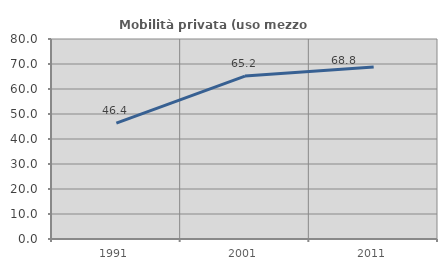
| Category | Mobilità privata (uso mezzo privato) |
|---|---|
| 1991.0 | 46.352 |
| 2001.0 | 65.161 |
| 2011.0 | 68.775 |